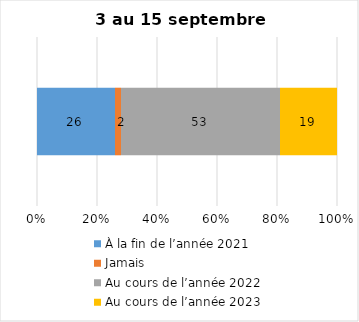
| Category | À la fin de l’année 2021 | Jamais | Au cours de l’année 2022 | Au cours de l’année 2023 |
|---|---|---|---|---|
| 0 | 26 | 2 | 53 | 19 |